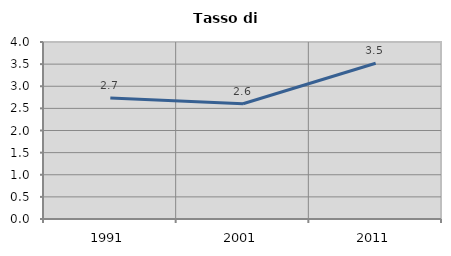
| Category | Tasso di disoccupazione   |
|---|---|
| 1991.0 | 2.735 |
| 2001.0 | 2.606 |
| 2011.0 | 3.519 |